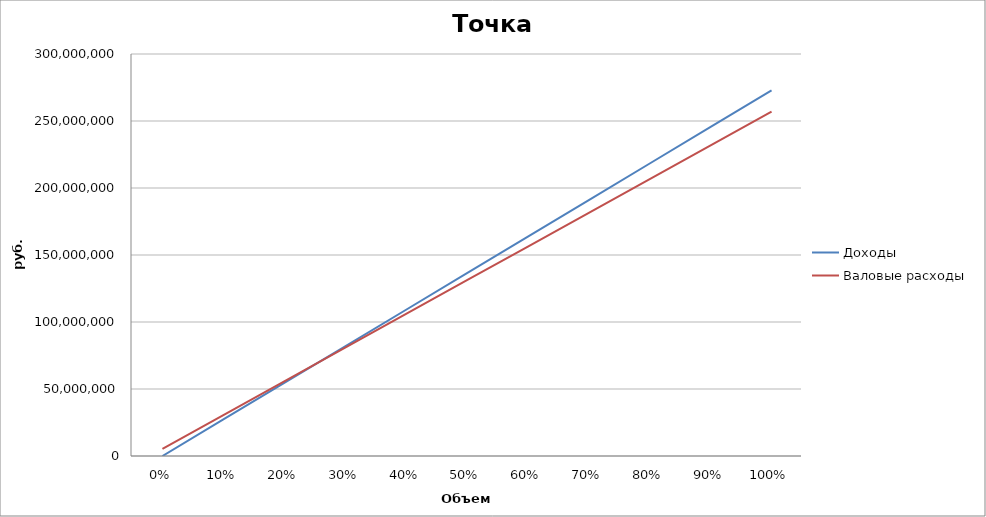
| Category | Доходы | Валовые расходы |
|---|---|---|
| 0.0 | 0 | 5400000 |
| 0.1 | 27285000 | 30551700 |
| 0.2 | 54570000 | 55703400 |
| 0.30000000000000004 | 81855000 | 80855100 |
| 0.4 | 109140000 | 106006800 |
| 0.5 | 136425000 | 131158500 |
| 0.6 | 163710000 | 156310200 |
| 0.7 | 190995000 | 181461900 |
| 0.7999999999999999 | 218280000 | 206613600 |
| 0.8999999999999999 | 245565000 | 231765300 |
| 0.9999999999999999 | 272850000 | 256917000 |